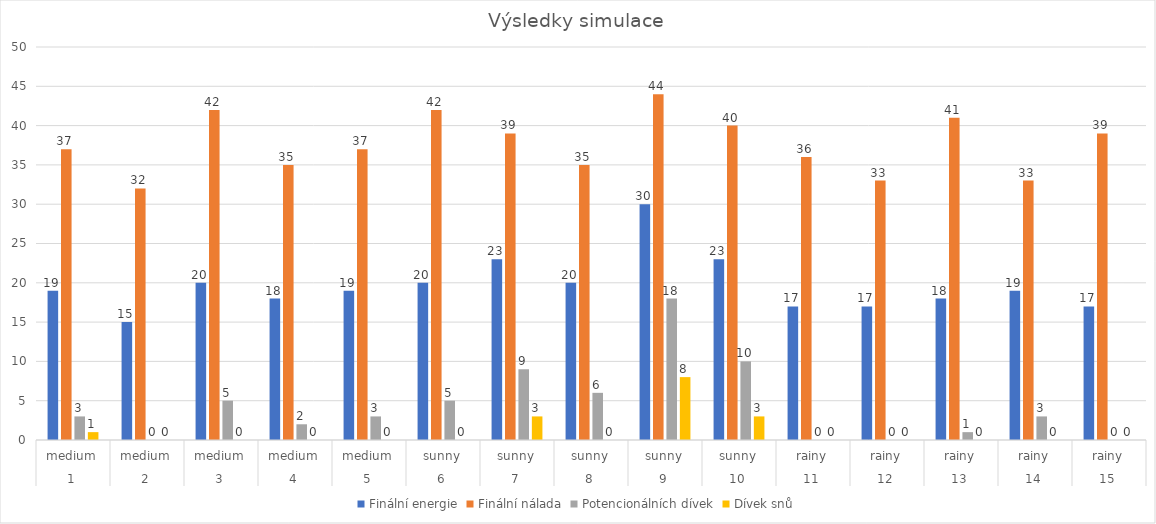
| Category | Finální energie | Finální nálada | Potencionálních dívek | Dívek snů |
|---|---|---|---|---|
| 0 | 19 | 37 | 3 | 1 |
| 1 | 15 | 32 | 0 | 0 |
| 2 | 20 | 42 | 5 | 0 |
| 3 | 18 | 35 | 2 | 0 |
| 4 | 19 | 37 | 3 | 0 |
| 5 | 20 | 42 | 5 | 0 |
| 6 | 23 | 39 | 9 | 3 |
| 7 | 20 | 35 | 6 | 0 |
| 8 | 30 | 44 | 18 | 8 |
| 9 | 23 | 40 | 10 | 3 |
| 10 | 17 | 36 | 0 | 0 |
| 11 | 17 | 33 | 0 | 0 |
| 12 | 18 | 41 | 1 | 0 |
| 13 | 19 | 33 | 3 | 0 |
| 14 | 17 | 39 | 0 | 0 |